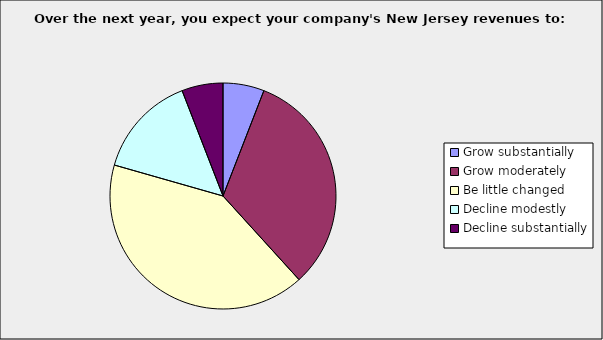
| Category | Series 0 |
|---|---|
| Grow substantially | 0.059 |
| Grow moderately | 0.324 |
| Be little changed | 0.412 |
| Decline modestly | 0.147 |
| Decline substantially | 0.059 |